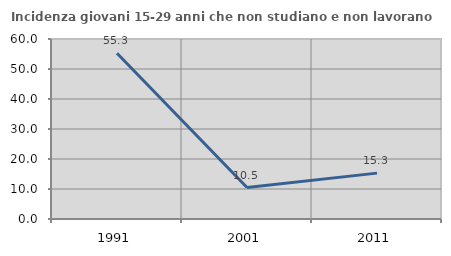
| Category | Incidenza giovani 15-29 anni che non studiano e non lavorano  |
|---|---|
| 1991.0 | 55.257 |
| 2001.0 | 10.484 |
| 2011.0 | 15.294 |